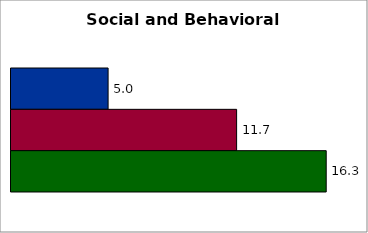
| Category | 50 states and D.C. | SREB states | State |
|---|---|---|---|
| 0 | 5.022 | 11.67 | 16.304 |